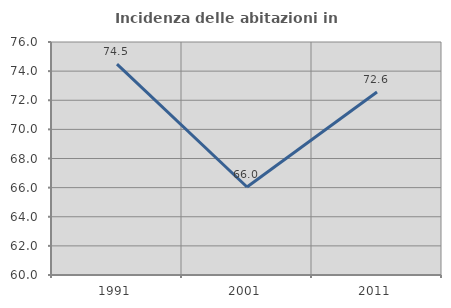
| Category | Incidenza delle abitazioni in proprietà  |
|---|---|
| 1991.0 | 74.476 |
| 2001.0 | 66.044 |
| 2011.0 | 72.571 |